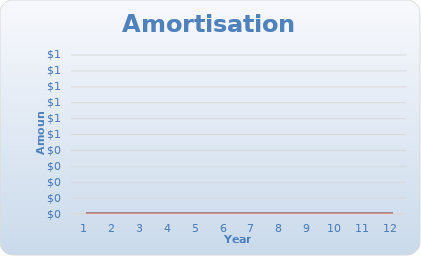
| Category | Cumulative Interest | Cumulative Principal |
|---|---|---|
| 1.0 | 19532.318 | 12941.26 |
| 2.0 | 37990.517 | 26956.638 |
| 3.0 | 55285.447 | 42135.285 |
| 4.0 | 71320.557 | 58573.753 |
| 5.0 | 85991.282 | 76376.605 |
| 6.0 | 99184.38 | 95657.085 |
| 7.0 | 110777.206 | 116537.836 |
| 8.0 | 120636.941 | 139151.679 |
| 9.0 | 128619.738 | 163642.459 |
| 10.0 | 134569.813 | 190165.962 |
| 11.0 | 138318.449 | 218890.903 |
| 12.0 | 139682.93 | 250000 |